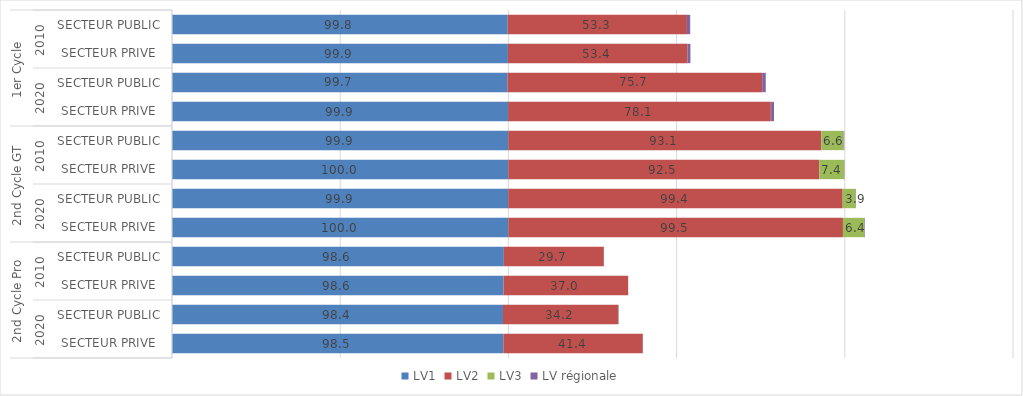
| Category | LV1 | LV2 | LV3 | LV régionale |
|---|---|---|---|---|
| 0 | 99.798 | 53.277 | 0 | 0.973 |
| 1 | 99.858 | 53.414 | 0 | 0.834 |
| 2 | 99.733 | 75.67 | 0.03 | 1.072 |
| 3 | 99.906 | 78.117 | 0.065 | 0.873 |
| 4 | 99.948 | 93.089 | 6.636 | 0.158 |
| 5 | 99.962 | 92.484 | 7.363 | 0.088 |
| 6 | 99.938 | 99.43 | 3.883 | 0.091 |
| 7 | 99.966 | 99.481 | 6.394 | 0.146 |
| 8 | 98.64 | 29.71 | 0 | 0.085 |
| 9 | 98.568 | 37.036 | 0 | 0.001 |
| 10 | 98.391 | 34.182 | 0.021 | 0.175 |
| 11 | 98.505 | 41.431 | 0.002 | 0.079 |